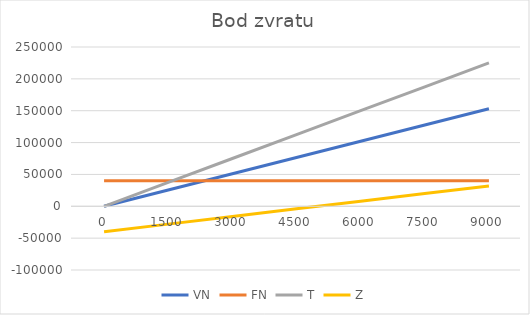
| Category | VN | FN | T | Z |
|---|---|---|---|---|
| 0.0 | 0 | 40000 | 0 | -40000 |
| 1500.0 | 25500 | 40000 | 37500 | -28000 |
| 3000.0 | 51000 | 40000 | 75000 | -16000 |
| 4500.0 | 76500 | 40000 | 112500 | -4000 |
| 6000.0 | 102000 | 40000 | 150000 | 8000 |
| 7500.0 | 127500 | 40000 | 187500 | 20000 |
| 9000.0 | 153000 | 40000 | 225000 | 32000 |